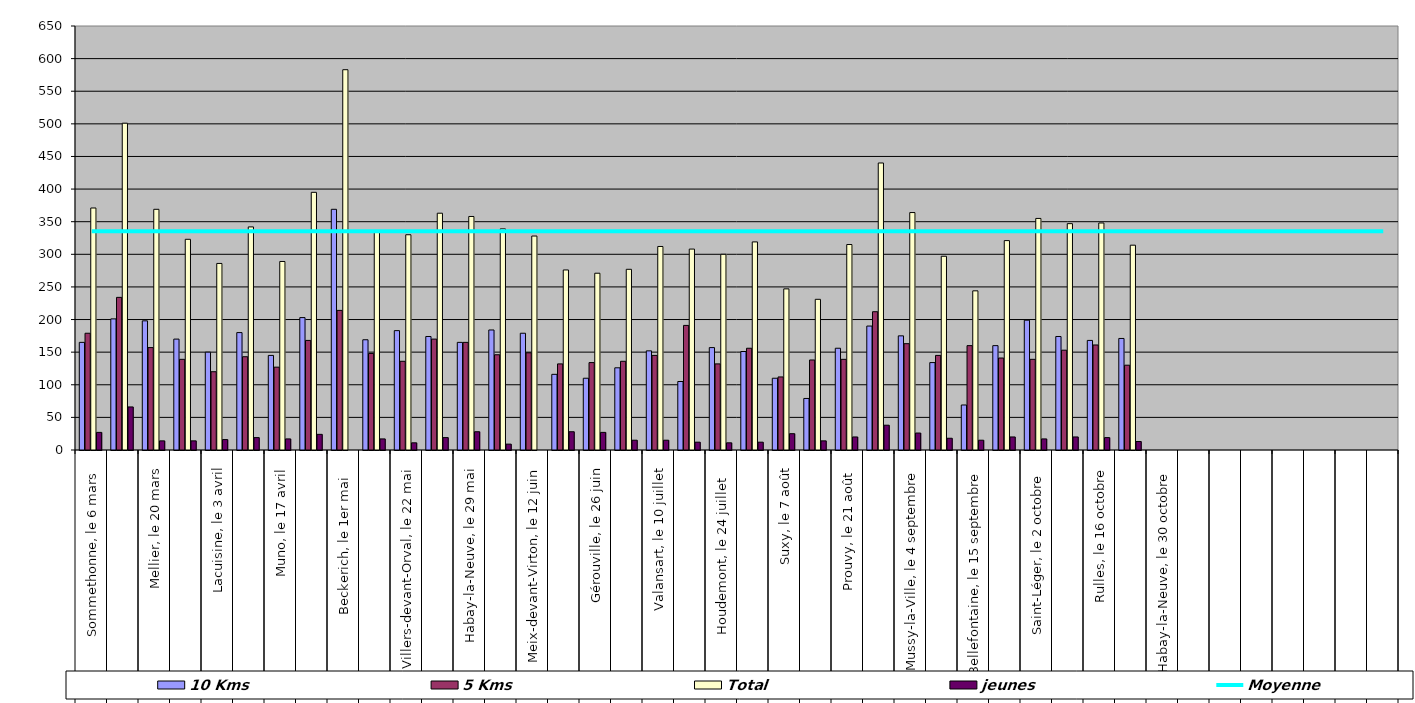
| Category | 10 Kms | 5 Kms | Total | jeunes |
|---|---|---|---|---|
| 0 | 165 | 179 | 371 | 27 |
| 1 | 201 | 234 | 501 | 66 |
| 2 | 198 | 157 | 369 | 14 |
| 3 | 170 | 139 | 323 | 14 |
| 4 | 150 | 120 | 286 | 16 |
| 5 | 180 | 143 | 342 | 19 |
| 6 | 145 | 127 | 289 | 17 |
| 7 | 203 | 168 | 395 | 24 |
| 8 | 369 | 214 | 583 | 0 |
| 9 | 169 | 148 | 334 | 17 |
| 10 | 183 | 136 | 330 | 11 |
| 11 | 174 | 170 | 363 | 19 |
| 12 | 165 | 165 | 358 | 28 |
| 13 | 184 | 146 | 339 | 9 |
| 14 | 179 | 149 | 328 | 0 |
| 15 | 116 | 132 | 276 | 28 |
| 16 | 110 | 134 | 271 | 27 |
| 17 | 126 | 136 | 277 | 15 |
| 18 | 152 | 145 | 312 | 15 |
| 19 | 105 | 191 | 308 | 12 |
| 20 | 157 | 132 | 300 | 11 |
| 21 | 151 | 156 | 319 | 12 |
| 22 | 110 | 112 | 247 | 25 |
| 23 | 79 | 138 | 231 | 14 |
| 24 | 156 | 139 | 315 | 20 |
| 25 | 190 | 212 | 440 | 38 |
| 26 | 175 | 163 | 364 | 26 |
| 27 | 134 | 145 | 297 | 18 |
| 28 | 69 | 160 | 244 | 15 |
| 29 | 160 | 141 | 321 | 20 |
| 30 | 199 | 139 | 355 | 17 |
| 31 | 174 | 153 | 347 | 20 |
| 32 | 168 | 161 | 348 | 19 |
| 33 | 171 | 130 | 314 | 13 |
| 34 | 0 | 0 | 0 | 0 |
| 35 | 0 | 0 | 0 | 0 |
| 36 | 0 | 0 | 0 | 0 |
| 37 | 0 | 0 | 0 | 0 |
| 38 | 0 | 0 | 0 | 0 |
| 39 | 0 | 0 | 0 | 0 |
| 40 | 0 | 0 | 0 | 0 |
| 41 | 0 | 0 | 0 | 0 |